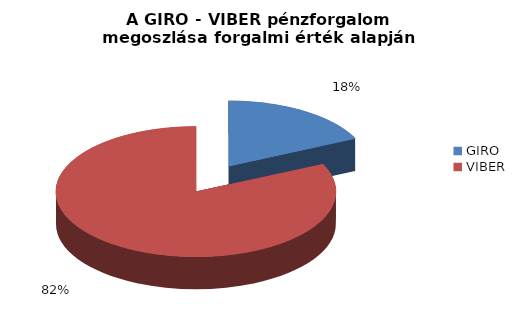
| Category | Forgalmi érték alapján 2016-ban |
|---|---|
| GIRO | 0.18 |
| VIBER | 0.82 |